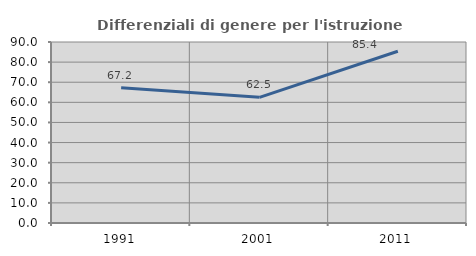
| Category | Differenziali di genere per l'istruzione superiore |
|---|---|
| 1991.0 | 67.217 |
| 2001.0 | 62.482 |
| 2011.0 | 85.404 |